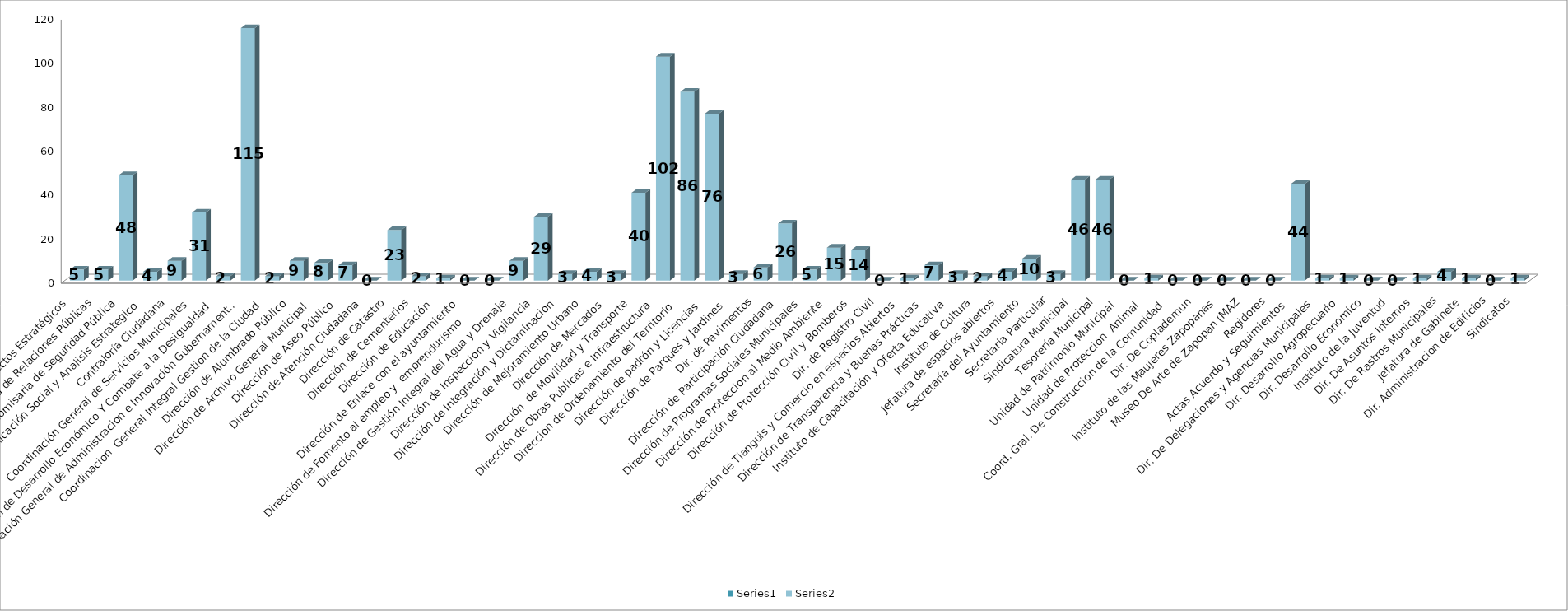
| Category | Series 0 | Series 1 |
|---|---|---|
| Area de Proyectos Estratégicos |  | 5 |
| Área de Relaciones Públicas |  | 5 |
| Comisaria de Seguridad Pública |  | 48 |
| Comunicación Social y Analisis Estrategico  |  | 4 |
| Contraloría Ciudadana |  | 9 |
| Coordinación General de Servicios Municipales |  | 31 |
| Coordinación de Desarrollo Económico Y Combate a la Desigualdad |  | 2 |
| Coordinación General de Administración e Innovación Gubernamental |  | 115 |
| Coordinacion  General Integral Gestion de la Ciudad |  | 2 |
| Dirección de Alumbrado Público |  | 9 |
| Dirección de Archivo General Municipal  |  | 8 |
| Dirección de Aseo Público  |  | 7 |
| Dirección de Atención Ciudadana |  | 0 |
| Dirección de Catastro |  | 23 |
| Dirección de Cementerios |  | 2 |
| Dirección de Educación  |  | 1 |
| Dirección de Enlace con el ayuntamiento |  | 0 |
| Dirección de Fomento al empleo y  emprendurismo         |  | 0 |
| Dirección de Gestión Integral del Agua y Drenaje |  | 9 |
| Dirección de Inspección y Vigilancia |  | 29 |
| Dirección de Integración y Dictaminación |  | 3 |
| Dirección de Mejoramiento Urbano |  | 4 |
| Dirección de Mercados  |  | 3 |
| Dirección  de Movilidad y Transporte |  | 40 |
| Dirección de Obras Públicas e Infraestructura |  | 102 |
| Dirección de Ordenamiento del Territorio  |  | 86 |
| Dirección de padrón y Licencias  |  | 76 |
| Dirección de Parques y Jardines  |  | 3 |
| Dir. de Pavimentos |  | 6 |
| Dirección de Participación Ciudadana |  | 26 |
| Dirección de Programas Sociales Municipales |  | 5 |
| Dirección de Protección al Medio Ambiente  |  | 15 |
| Dirección de Protección Civil y Bomberos |  | 14 |
| Dir. de Registro Civil |  | 0 |
| Dirección de Tianguis y Comercio en espacios Abiertos |  | 1 |
| Dirección de Transparencia y Buenas Prácticas |  | 7 |
| Instituto de Capacitación y Oferta Educativa |  | 3 |
| Instituto de Cultura  |  | 2 |
| Jefatura de espacios abiertos |  | 4 |
| Secretaría del Ayuntamiento |  | 10 |
| Secretaria Particular |  | 3 |
| Sindicatura Municipal |  | 46 |
| Tesorería Municipal |  | 46 |
| Unidad de Patrimonio Municipal  |  | 0 |
| Unidad de Protección  Animal  |  | 1 |
| Coord. Gral. De Construccion de la Comunidad |  | 0 |
| Dir. De Coplademun |  | 0 |
| Instituto de las Maujeres Zapopanas |  | 0 |
| Museo De Arte de Zapopan (MAZ |  | 0 |
| Regidores |  | 0 |
| Actas Acuerdo y Seguimientos  |  | 44 |
| Dir. De Delegaciones y Agencias Municipales |  | 1 |
|  Dir. Desarrollo Agropecuario |  | 1 |
| Dir. Desarrollo Economico |  | 0 |
| Instituto de la Juventud |  | 0 |
| Dir. De Asuntos Internos |  | 1 |
| Dir. De Rastros Municipales |  | 4 |
| Jefatura de Gabinete |  | 1 |
| Dir. Administracion de Edificios |  | 0 |
| Sindicatos |  | 1 |